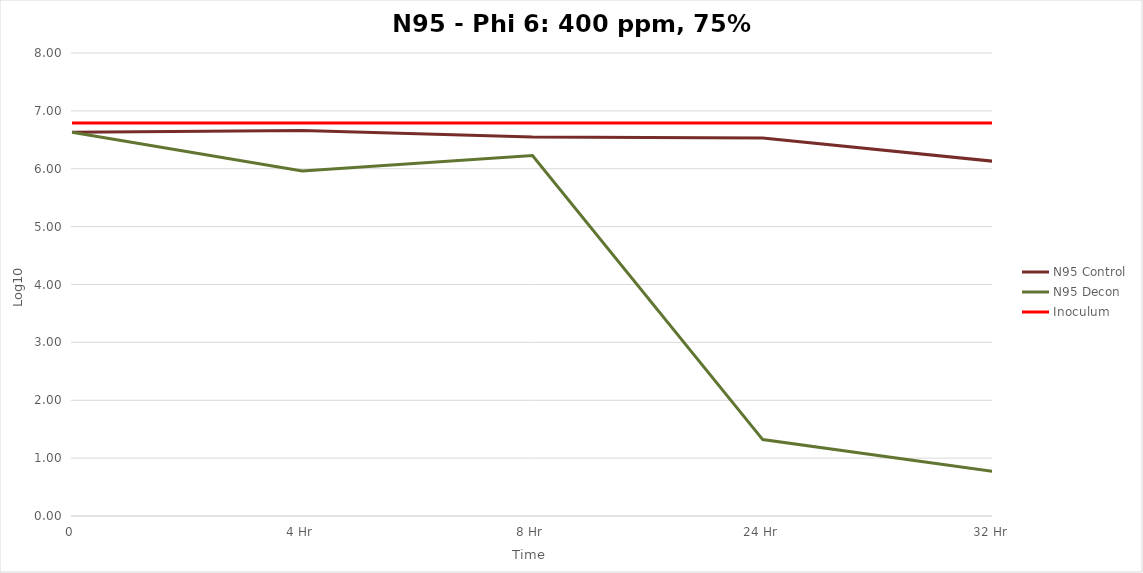
| Category | N95 Control | N95 Decon | Inoculum |
|---|---|---|---|
| 0 | 6.63 | 6.63 | 6.79 |
| 4 Hr | 6.66 | 5.96 | 6.79 |
| 8 Hr | 6.55 | 6.23 | 6.79 |
| 24 Hr | 6.53 | 1.32 | 6.79 |
| 32 Hr | 6.13 | 0.77 | 6.79 |